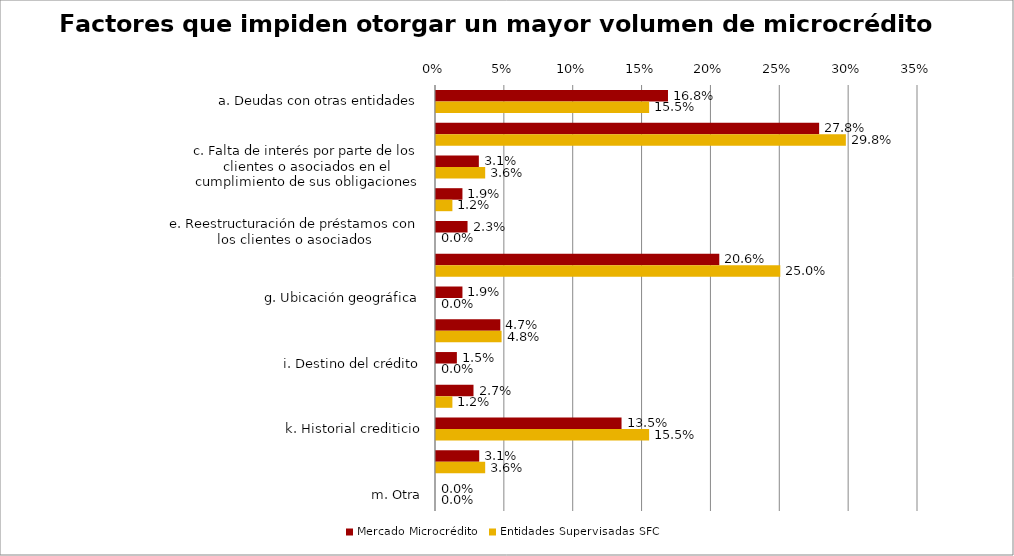
| Category | Mercado Microcrédito | Entidades Supervisadas SFC |
|---|---|---|
| a. Deudas con otras entidades | 0.168 | 0.155 |
| b. Capacidad de pago de los clientes | 0.278 | 0.298 |
| c. Falta de interés por parte de los clientes o asociados en el cumplimiento de sus obligaciones | 0.031 | 0.036 |
| d. Actividad económica del cliente o asocidado | 0.019 | 0.012 |
| e. Reestructuración de préstamos con los clientes o asociados | 0.023 | 0 |
| f. El nivel de deuda del cliente, con su entidad o con otras instituciones, es superior a su capacidad de pago (sobrendeudamiento) | 0.206 | 0.25 |
| g. Ubicación geográfica | 0.019 | 0 |
| h. Poca experiencia en su actividad económica | 0.047 | 0.048 |
| i. Destino del crédito | 0.015 | 0 |
| j. Falta de información financiera de los nuevos clientes o asociados | 0.027 | 0.012 |
| k. Historial crediticio | 0.135 | 0.155 |
| l. Medidas adoptadas por los entes reguladores | 0.031 | 0.036 |
| m. Otra | 0 | 0 |